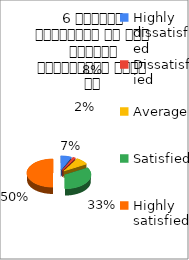
| Category | 6 शिक्षक समयनिष्ट है एवं नियमित व्याख्यान देते है  |
|---|---|
| Highly dissatisfied | 4 |
| Dissatisfied | 1 |
| Average | 5 |
| Satisfied | 20 |
| Highly satisfied | 30 |